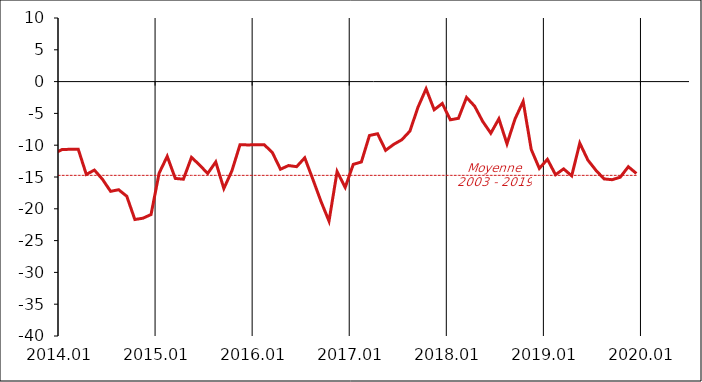
| Category | Series 1 | Moyenne
2003 - 2019 |
|---|---|---|
| 2003-01-20 | -11 | -14.74 |
| 2003-02-20 | -20 | -14.74 |
| 2003-03-20 | -22 | -14.74 |
| 2003-04-20 | -14 | -14.74 |
| 2003-05-20 | -12 | -14.74 |
| 2003-06-20 | -14 | -14.74 |
| 2003-07-20 | -13 | -14.74 |
| 2003-08-20 | -12 | -14.74 |
| 2003-09-20 | -11 | -14.74 |
| 2003-10-20 | -14 | -14.74 |
| 2003-11-20 | -7 | -14.74 |
| 2003-12-20 | -11 | -14.74 |
| 2004-01-20 | -11 | -14.74 |
| 2004-02-20 | -9 | -14.74 |
| 2004-03-20 | -9 | -14.74 |
| 2004-04-20 | -12 | -14.74 |
| 2004-05-20 | -11 | -14.74 |
| 2004-06-20 | -8 | -14.74 |
| 2004-07-20 | -11 | -14.74 |
| 2004-08-20 | -8 | -14.74 |
| 2004-09-20 | -12 | -14.74 |
| 2004-10-20 | -13 | -14.74 |
| 2004-11-20 | -14 | -14.74 |
| 2004-12-20 | -10 | -14.74 |
| 2005-01-20 | -14 | -14.74 |
| 2005-02-20 | -9 | -14.74 |
| 2005-03-20 | -12 | -14.74 |
| 2005-04-20 | -15 | -14.74 |
| 2005-05-20 | -17 | -14.74 |
| 2005-06-20 | -17 | -14.74 |
| 2005-07-20 | -18 | -14.74 |
| 2005-08-20 | -18 | -14.74 |
| 2005-09-20 | -21 | -14.74 |
| 2005-10-20 | -16 | -14.74 |
| 2005-11-20 | -15 | -14.74 |
| 2005-12-20 | -11 | -14.74 |
| 2006-01-20 | -11 | -14.74 |
| 2006-02-20 | -14 | -14.74 |
| 2006-03-20 | -14 | -14.74 |
| 2006-04-20 | -14 | -14.74 |
| 2006-05-20 | -15 | -14.74 |
| 2006-06-20 | -10 | -14.74 |
| 2006-07-20 | -9 | -14.74 |
| 2006-08-20 | -11 | -14.74 |
| 2006-09-20 | -13 | -14.74 |
| 2006-10-20 | -9 | -14.74 |
| 2006-11-20 | -7 | -14.74 |
| 2006-12-20 | -17 | -14.74 |
| 2007-01-20 | -13 | -14.74 |
| 2007-02-20 | -8 | -14.74 |
| 2007-03-20 | -9 | -14.74 |
| 2007-04-20 | -6 | -14.74 |
| 2007-05-20 | -4 | -14.74 |
| 2007-06-20 | -7 | -14.74 |
| 2007-07-20 | -8 | -14.74 |
| 2007-08-20 | -11 | -14.74 |
| 2007-09-20 | -7 | -14.74 |
| 2007-10-20 | -8 | -14.74 |
| 2007-11-20 | -16 | -14.74 |
| 2007-12-20 | -12 | -14.74 |
| 2008-01-20 | -15 | -14.74 |
| 2008-02-20 | -15 | -14.74 |
| 2008-03-20 | -11 | -14.74 |
| 2008-04-20 | -16 | -14.74 |
| 2008-05-20 | -17 | -14.74 |
| 2008-06-20 | -21 | -14.74 |
| 2008-07-20 | -19 | -14.74 |
| 2008-08-20 | -17 | -14.74 |
| 2008-09-20 | -17 | -14.74 |
| 2008-10-20 | -22 | -14.74 |
| 2008-11-20 | -25 | -14.74 |
| 2008-12-20 | -28 | -14.74 |
| 2009-01-20 | -27 | -14.74 |
| 2009-02-20 | -32 | -14.74 |
| 2009-03-20 | -30 | -14.74 |
| 2009-04-20 | -32 | -14.74 |
| 2009-05-20 | -28 | -14.74 |
| 2009-06-20 | -26 | -14.74 |
| 2009-07-20 | -26 | -14.74 |
| 2009-08-20 | -25 | -14.74 |
| 2009-09-20 | -24 | -14.74 |
| 2009-10-20 | -22 | -14.74 |
| 2009-11-20 | -21 | -14.74 |
| 2009-12-20 | -22 | -14.74 |
| 2010-01-20 | -24 | -14.74 |
| 2010-02-20 | -23 | -14.74 |
| 2010-03-20 | -21 | -14.74 |
| 2010-04-20 | -17 | -14.74 |
| 2010-05-20 | -21 | -14.74 |
| 2010-06-20 | -16 | -14.74 |
| 2010-07-20 | -14 | -14.74 |
| 2010-08-20 | -15 | -14.74 |
| 2010-09-20 | -15 | -14.74 |
| 2010-10-20 | -15 | -14.74 |
| 2010-11-20 | -11 | -14.74 |
| 2010-12-20 | -13 | -14.74 |
| 2011-01-20 | -16 | -14.74 |
| 2011-02-20 | -13 | -14.74 |
| 2011-03-20 | -14 | -14.74 |
| 2011-04-20 | -14 | -14.74 |
| 2011-05-20 | -9 | -14.74 |
| 2011-06-20 | -15 | -14.74 |
| 2011-07-20 | -15 | -14.74 |
| 2011-08-20 | -15 | -14.74 |
| 2011-09-20 | -15 | -14.74 |
| 2011-10-20 | -13 | -14.74 |
| 2011-11-20 | -22 | -14.74 |
| 2011-12-20 | -16 | -14.74 |
| 2012-01-20 | -22 | -14.74 |
| 2012-02-20 | -23 | -14.74 |
| 2012-03-20 | -18 | -14.74 |
| 2012-04-20 | -19 | -14.74 |
| 2012-05-20 | -17 | -14.74 |
| 2012-06-20 | -18 | -14.74 |
| 2012-07-20 | -15 | -14.74 |
| 2012-08-20 | -20 | -14.74 |
| 2012-09-20 | -19 | -14.74 |
| 2012-10-20 | -22 | -14.74 |
| 2012-11-20 | -28.868 | -14.74 |
| 2012-12-20 | -26.412 | -14.74 |
| 2013-01-20 | -23.159 | -14.74 |
| 2013-02-20 | -23.478 | -14.74 |
| 2013-03-20 | -27.014 | -14.74 |
| 2013-04-20 | -27.398 | -14.74 |
| 2013-05-20 | -26.536 | -14.74 |
| 2013-06-20 | -26.265 | -14.74 |
| 2013-07-20 | -22.967 | -14.74 |
| 2013-08-20 | -21.009 | -14.74 |
| 2013-09-20 | -14.923 | -14.74 |
| 2013-10-20 | -15.692 | -14.74 |
| 2013-11-20 | -12.612 | -14.74 |
| 2013-12-20 | -11.303 | -14.74 |
| 2014-01-20 | -10.69 | -14.74 |
| 2014-02-20 | -10.641 | -14.74 |
| 2014-03-20 | -10.626 | -14.74 |
| 2014-04-20 | -14.595 | -14.74 |
| 2014-05-20 | -13.912 | -14.74 |
| 2014-06-20 | -15.363 | -14.74 |
| 2014-07-20 | -17.254 | -14.74 |
| 2014-08-20 | -17.002 | -14.74 |
| 2014-09-20 | -18.028 | -14.74 |
| 2014-10-20 | -21.685 | -14.74 |
| 2014-11-20 | -21.478 | -14.74 |
| 2014-12-20 | -20.904 | -14.74 |
| 2015-01-20 | -14.397 | -14.74 |
| 2015-02-20 | -11.752 | -14.74 |
| 2015-03-20 | -15.224 | -14.74 |
| 2015-04-20 | -15.347 | -14.74 |
| 2015-05-20 | -11.911 | -14.74 |
| 2015-06-20 | -13.109 | -14.74 |
| 2015-07-20 | -14.453 | -14.74 |
| 2015-08-20 | -12.63 | -14.74 |
| 2015-09-20 | -16.815 | -14.74 |
| 2015-10-20 | -14.017 | -14.74 |
| 2015-11-20 | -9.918 | -14.74 |
| 2015-12-20 | -9.958 | -14.74 |
| 2016-01-20 | -9.925 | -14.74 |
| 2016-02-20 | -9.928 | -14.74 |
| 2016-03-20 | -11.165 | -14.74 |
| 2016-04-20 | -13.78 | -14.74 |
| 2016-05-20 | -13.198 | -14.74 |
| 2016-06-20 | -13.377 | -14.74 |
| 2016-07-20 | -11.982 | -14.74 |
| 2016-08-20 | -15.345 | -14.74 |
| 2016-09-20 | -18.81 | -14.74 |
| 2016-10-20 | -21.937 | -14.74 |
| 2016-11-20 | -14.144 | -14.74 |
| 2016-12-20 | -16.634 | -14.74 |
| 2017-01-20 | -13.013 | -14.74 |
| 2017-02-20 | -12.638 | -14.74 |
| 2017-03-20 | -8.474 | -14.74 |
| 2017-04-20 | -8.197 | -14.74 |
| 2017-05-20 | -10.808 | -14.74 |
| 2017-06-20 | -9.864 | -14.74 |
| 2017-07-20 | -9.146 | -14.74 |
| 2017-08-20 | -7.786 | -14.74 |
| 2017-09-20 | -4.026 | -14.74 |
| 2017-10-20 | -1.136 | -14.74 |
| 2017-11-20 | -4.424 | -14.74 |
| 2017-12-20 | -3.442 | -14.74 |
| 2018-01-20 | -6.007 | -14.74 |
| 2018-02-20 | -5.772 | -14.74 |
| 2018-03-20 | -2.491 | -14.74 |
| 2018-04-20 | -3.857 | -14.74 |
| 2018-05-20 | -6.265 | -14.74 |
| 2018-06-20 | -8.118 | -14.74 |
| 2018-07-20 | -5.843 | -14.74 |
| 2018-08-20 | -9.788 | -14.74 |
| 2018-09-20 | -5.853 | -14.74 |
| 2018-10-20 | -3.121 | -14.74 |
| 2018-11-20 | -10.675 | -14.74 |
| 2018-12-20 | -13.654 | -14.74 |
| 2019-01-20 | -12.22 | -14.74 |
| 2019-02-20 | -14.641 | -14.74 |
| 2019-03-20 | -13.725 | -14.74 |
| 2019-04-20 | -14.816 | -14.74 |
| 2019-05-20 | -9.672 | -14.74 |
| 2019-06-20 | -12.339 | -14.74 |
| 2019-07-20 | -13.954 | -14.74 |
| 2019-08-20 | -15.302 | -14.74 |
| 2019-09-20 | -15.425 | -14.74 |
| 2019-10-20 | -15.033 | -14.74 |
| 2019-11-20 | -13.383 | -14.74 |
| 2019-12-20 | -14.448 | -14.74 |